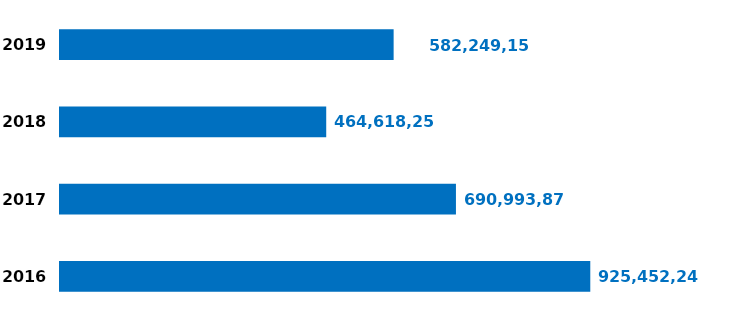
| Category | Risultato dell'esercizio |
|---|---|
| 2016.0 | 925452241 |
| 2017.0 | 690993879 |
| 2018.0 | 464618251 |
| 2019.0 | 582249155 |